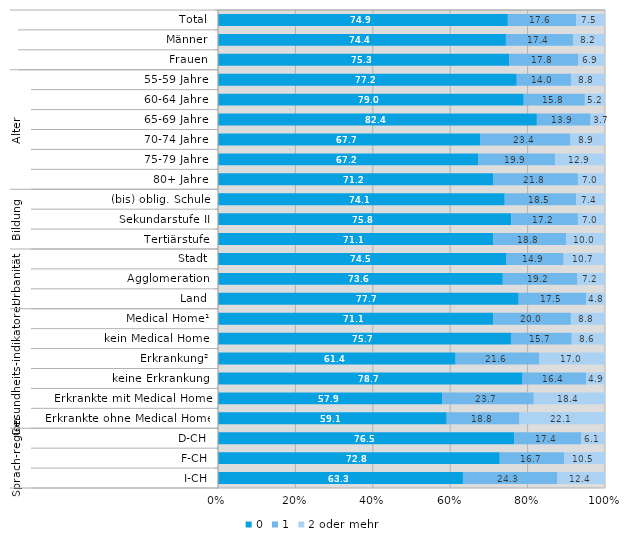
| Category | 0 | 1 | 2 oder mehr |
|---|---|---|---|
| 0 | 74.9 | 17.6 | 7.5 |
| 1 | 74.4 | 17.4 | 8.2 |
| 2 | 75.3 | 17.8 | 6.9 |
| 3 | 77.2 | 14 | 8.8 |
| 4 | 79 | 15.8 | 5.2 |
| 5 | 82.4 | 13.9 | 3.7 |
| 6 | 67.7 | 23.4 | 8.9 |
| 7 | 67.2 | 19.9 | 12.9 |
| 8 | 71.2 | 21.8 | 7 |
| 9 | 74.1 | 18.5 | 7.4 |
| 10 | 75.8 | 17.2 | 7 |
| 11 | 71.1 | 18.8 | 10 |
| 12 | 74.5 | 14.9 | 10.7 |
| 13 | 73.6 | 19.2 | 7.2 |
| 14 | 77.7 | 17.5 | 4.8 |
| 15 | 71.1 | 20 | 8.8 |
| 16 | 75.7 | 15.7 | 8.6 |
| 17 | 61.4 | 21.6 | 17 |
| 18 | 78.7 | 16.4 | 4.9 |
| 19 | 57.9 | 23.7 | 18.4 |
| 20 | 59.1 | 18.8 | 22.1 |
| 21 | 76.5 | 17.4 | 6.1 |
| 22 | 72.8 | 16.7 | 10.5 |
| 23 | 63.3 | 24.3 | 12.4 |